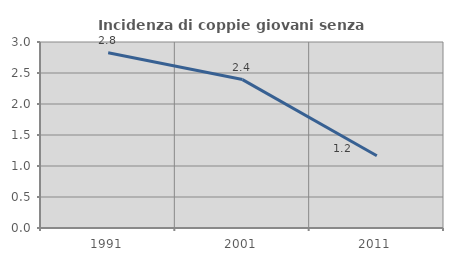
| Category | Incidenza di coppie giovani senza figli |
|---|---|
| 1991.0 | 2.828 |
| 2001.0 | 2.394 |
| 2011.0 | 1.166 |